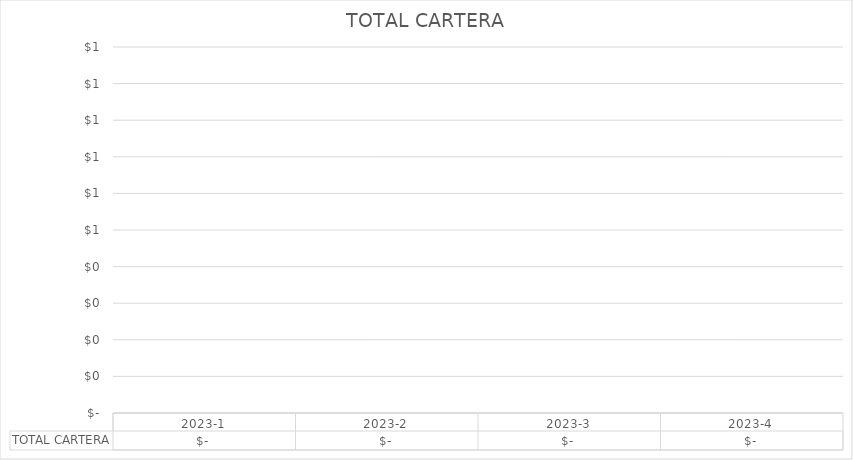
| Category | TOTAL CARTERA |
|---|---|
| 2023-1 | 0 |
| 2023-2 | 0 |
| 2023-3 | 0 |
| 2023-4 | 0 |